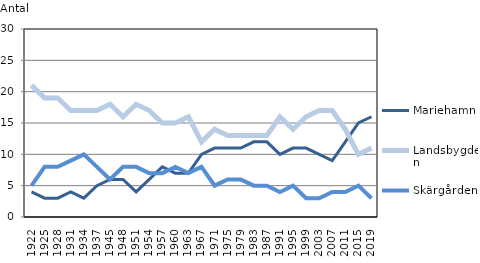
| Category | Mariehamn | Landsbygden | Skärgården |
|---|---|---|---|
| 1922.0 | 4 | 21 | 5 |
| 1925.0 | 3 | 19 | 8 |
| 1928.0 | 3 | 19 | 8 |
| 1931.0 | 4 | 17 | 9 |
| 1934.0 | 3 | 17 | 10 |
| 1937.0 | 5 | 17 | 8 |
| 1945.0 | 6 | 18 | 6 |
| 1948.0 | 6 | 16 | 8 |
| 1951.0 | 4 | 18 | 8 |
| 1954.0 | 6 | 17 | 7 |
| 1957.0 | 8 | 15 | 7 |
| 1960.0 | 7 | 15 | 8 |
| 1963.0 | 7 | 16 | 7 |
| 1967.0 | 10 | 12 | 8 |
| 1971.0 | 11 | 14 | 5 |
| 1975.0 | 11 | 13 | 6 |
| 1979.0 | 11 | 13 | 6 |
| 1983.0 | 12 | 13 | 5 |
| 1987.0 | 12 | 13 | 5 |
| 1991.0 | 10 | 16 | 4 |
| 1995.0 | 11 | 14 | 5 |
| 1999.0 | 11 | 16 | 3 |
| 2003.0 | 10 | 17 | 3 |
| 2007.0 | 9 | 17 | 4 |
| 2011.0 | 12 | 14 | 4 |
| 2015.0 | 15 | 10 | 5 |
| 2019.0 | 16 | 11 | 3 |